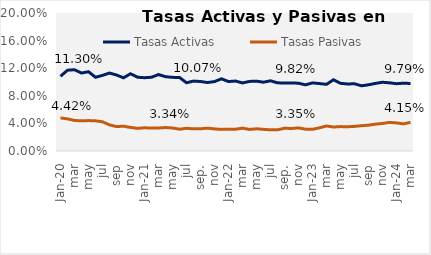
| Category | Tasas Activas  | Tasas Pasivas |
|---|---|---|
| ene-20 | 0.108 | 0.048 |
| feb | 0.117 | 0.047 |
| mar | 0.118 | 0.044 |
| abr | 0.113 | 0.044 |
| may | 0.115 | 0.044 |
| jun | 0.107 | 0.044 |
| jul | 0.11 | 0.042 |
| ago | 0.113 | 0.038 |
| sep | 0.11 | 0.035 |
| oct | 0.106 | 0.036 |
| nov | 0.112 | 0.034 |
| dic | 0.107 | 0.033 |
| ene-21 | 0.106 | 0.034 |
| feb | 0.107 | 0.033 |
| mar | 0.111 | 0.033 |
| abr | 0.108 | 0.034 |
| may | 0.107 | 0.033 |
| jun | 0.107 | 0.032 |
| jul | 0.099 | 0.033 |
| ago | 0.101 | 0.032 |
| sep. | 0.101 | 0.032 |
| oct. | 0.099 | 0.033 |
| nov | 0.101 | 0.032 |
| dic | 0.105 | 0.031 |
| ene-22 | 0.101 | 0.032 |
| feb | 0.101 | 0.032 |
| mar | 0.099 | 0.033 |
| apr | 0.101 | 0.031 |
| may | 0.101 | 0.032 |
| Jun | 0.1 | 0.031 |
| jul | 0.102 | 0.031 |
| ago | 0.099 | 0.031 |
| sep. | 0.099 | 0.033 |
| oct | 0.099 | 0.033 |
| nov | 0.098 | 0.034 |
| dic | 0.096 | 0.032 |
| ene-23 | 0.099 | 0.031 |
| feb | 0.098 | 0.034 |
| mar | 0.097 | 0.036 |
| abr | 0.103 | 0.035 |
| may | 0.098 | 0.035 |
| jun | 0.097 | 0.035 |
| jul | 0.097 | 0.036 |
| ago | 0.095 | 0.037 |
| sep | 0.096 | 0.037 |
| oct | 0.098 | 0.039 |
| nov | 0.1 | 0.04 |
| dic | 0.099 | 0.041 |
| ene-24 | 0.098 | 0.041 |
| feb | 0.098 | 0.039 |
| mar | 0.098 | 0.042 |